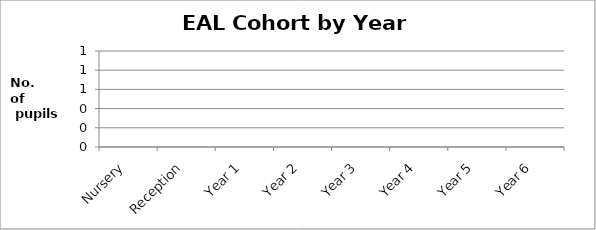
| Category | Series 0 | Series 1 |
|---|---|---|
| Nursery | 0 |  |
| Reception | 0 |  |
| Year 1 | 0 |  |
| Year 2 | 0 |  |
| Year 3 | 0 |  |
| Year 4 | 0 |  |
| Year 5 | 0 |  |
| Year 6 | 0 |  |